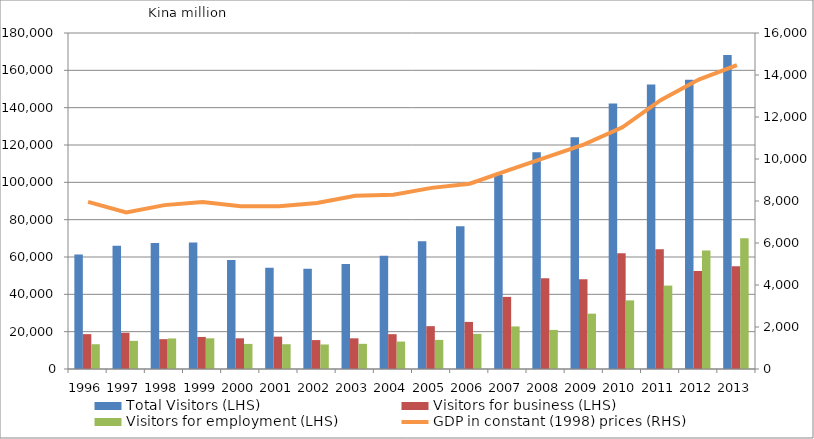
| Category | Total Visitors (LHS) | Visitors for business (LHS) | Visitors for employment (LHS) |
|---|---|---|---|
| 1996.0 | 61392 | 18682 | 13276 |
| 1997.0 | 65960 | 19429 | 15069 |
| 1998.0 | 67545 | 15986 | 16361 |
| 1999.0 | 67816 | 17175 | 16444 |
| 2000.0 | 58448 | 16441 | 13439 |
| 2001.0 | 54235 | 17331 | 13279 |
| 2002.0 | 53762 | 15492 | 13138 |
| 2003.0 | 56282 | 16427 | 13480 |
| 2004.0 | 60715 | 18663 | 14707 |
| 2005.0 | 68450 | 22947 | 15598 |
| 2006.0 | 76504 | 25231 | 18815 |
| 2007.0 | 104122 | 38633 | 22793 |
| 2008.0 | 116158 | 48588 | 20941 |
| 2009.0 | 124199 | 48043 | 29658 |
| 2010.0 | 142178 | 62020 | 36756 |
| 2011.0 | 152454 | 64105 | 44675 |
| 2012.0 | 155008 | 52435 | 63503 |
| 2013.0 | 168212 | 55026 | 70008 |